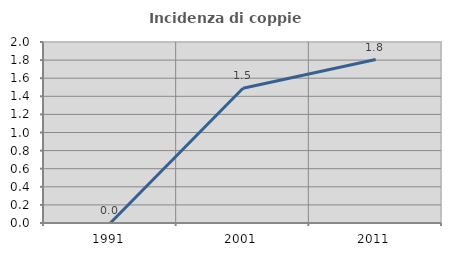
| Category | Incidenza di coppie miste |
|---|---|
| 1991.0 | 0 |
| 2001.0 | 1.489 |
| 2011.0 | 1.806 |